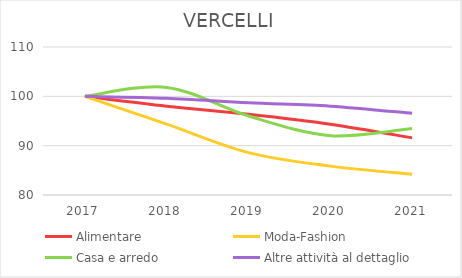
| Category | Alimentare | Moda-Fashion | Casa e arredo | Altre attività al dettaglio |
|---|---|---|---|---|
| 2017.0 | 100 | 100 | 100 | 100 |
| 2018.0 | 97.99 | 94.368 | 101.812 | 99.617 |
| 2019.0 | 96.357 | 88.599 | 96.014 | 98.698 |
| 2020.0 | 94.347 | 85.852 | 92.029 | 98.009 |
| 2021.0 | 91.583 | 84.203 | 93.478 | 96.554 |